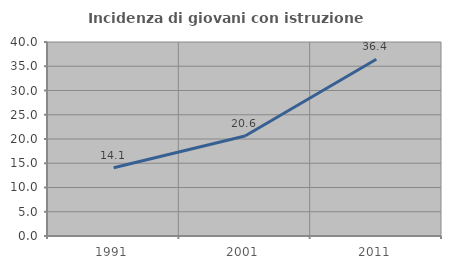
| Category | Incidenza di giovani con istruzione universitaria |
|---|---|
| 1991.0 | 14.068 |
| 2001.0 | 20.615 |
| 2011.0 | 36.428 |